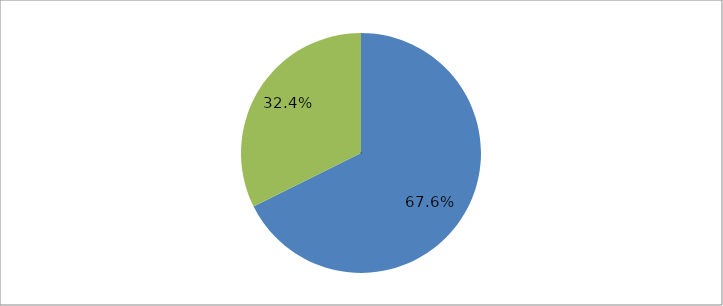
| Category | Series 0 |
|---|---|
| 0 | 0.676 |
| 1 | 0.324 |